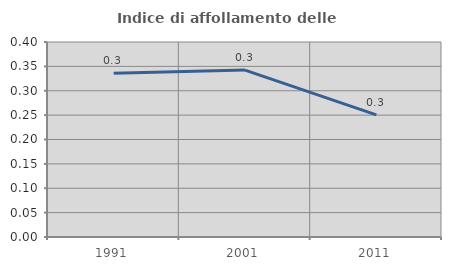
| Category | Indice di affollamento delle abitazioni  |
|---|---|
| 1991.0 | 0.336 |
| 2001.0 | 0.342 |
| 2011.0 | 0.25 |